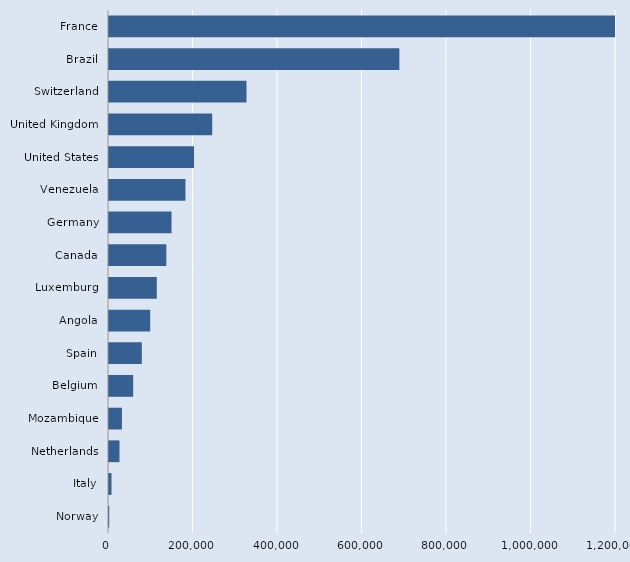
| Category | Series 0 |
|---|---|
| Norway | 538 |
| Italy | 5945 |
| Netherlands | 24847 |
| Mozambique | 30582 |
| Belgium | 57215 |
| Spain | 77710 |
| Angola | 97576 |
| Luxemburg | 113145 |
| Canada | 135678 |
| Germany | 147992 |
| Venezuela | 180959 |
| United States | 201227 |
| United Kingdom | 244252 |
| Switzerland | 325459 |
| Brazil | 687322 |
| France | 1258953 |